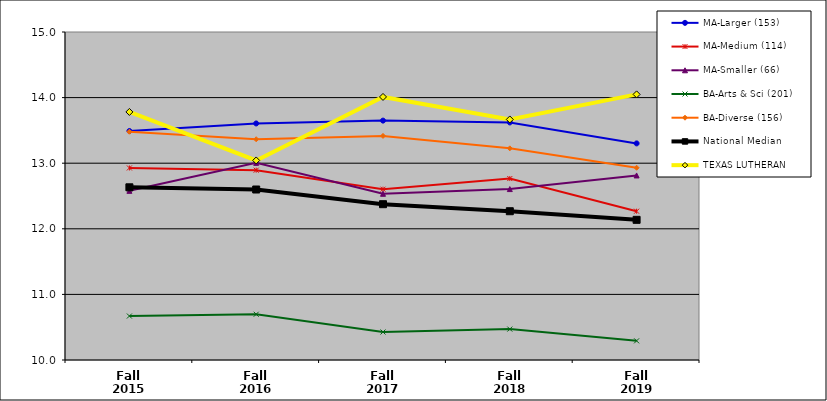
| Category | MA-Larger (153) | MA-Medium (114) | MA-Smaller (66) | BA-Arts & Sci (201) | BA-Diverse (156) | National Median | TEXAS LUTHERAN |
|---|---|---|---|---|---|---|---|
| Fall 2015 | 13.491 | 12.927 | 12.579 | 10.67 | 13.48 | 12.633 | 13.781 |
| Fall 2016 | 13.606 | 12.894 | 13.005 | 10.697 | 13.365 | 12.599 | 13.042 |
| Fall 2017 | 13.649 | 12.604 | 12.534 | 10.427 | 13.416 | 12.375 | 14.01 |
| Fall 2018 | 13.621 | 12.766 | 12.605 | 10.471 | 13.226 | 12.268 | 13.667 |
| Fall 2019 | 13.302 | 12.268 | 12.813 | 10.292 | 12.931 | 12.137 | 14.049 |